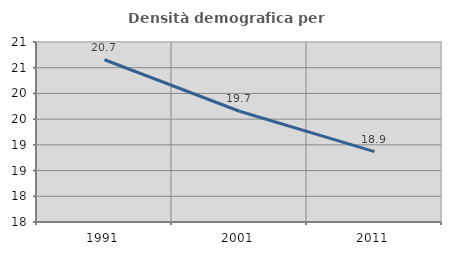
| Category | Densità demografica |
|---|---|
| 1991.0 | 20.655 |
| 2001.0 | 19.653 |
| 2011.0 | 18.869 |